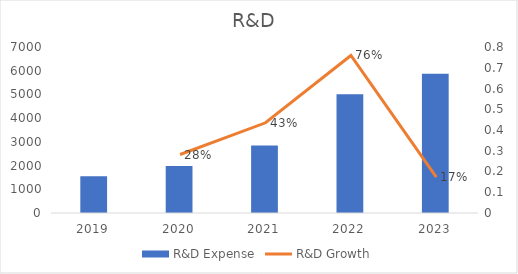
| Category | R&D Expense |
|---|---|
| 2019.0 | 1547 |
| 2020.0 | 1983 |
| 2021.0 | 2845 |
| 2022.0 | 5005 |
| 2023.0 | 5872 |